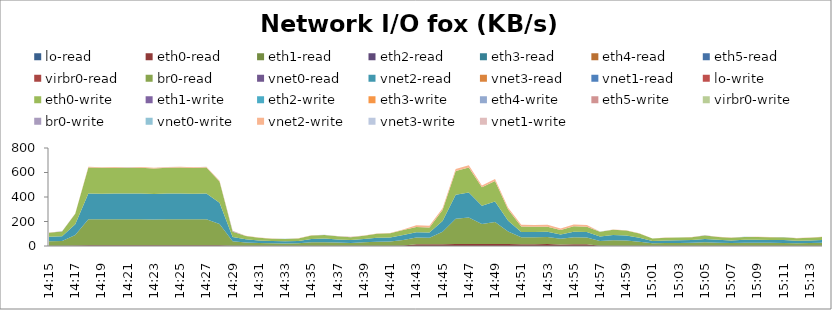
| Category | lo-read | eth0-read | eth1-read | eth2-read | eth3-read | eth4-read | eth5-read | virbr0-read | br0-read | vnet0-read | vnet2-read | vnet3-read | vnet1-read | lo-write | eth0-write | eth1-write | eth2-write | eth3-write | eth4-write | eth5-write | virbr0-write | br0-write | vnet0-write | vnet2-write | vnet3-write | vnet1-write |
|---|---|---|---|---|---|---|---|---|---|---|---|---|---|---|---|---|---|---|---|---|---|---|---|---|---|---|
| 14:15 | 0 | 1.9 | 0 | 0 | 0 | 0 | 0 | 0 | 37.3 | 0 | 36.4 | 0 | 0 | 0 | 32.4 | 0 | 0 | 0 | 0 | 0 | 0 | 0.1 | 0 | 1.7 | 0 | 0 |
| 14:16 | 0 | 2 | 0 | 0 | 0 | 0 | 0 | 0 | 39.2 | 0 | 38.1 | 0 | 0 | 0 | 39.1 | 0 | 0 | 0 | 0 | 0 | 0 | 1.1 | 0.1 | 1.6 | 0.1 | 0.1 |
| 14:17 | 0 | 3.2 | 0 | 0 | 0 | 0 | 0 | 0 | 87.6 | 0 | 86.3 | 0 | 0 | 0 | 85.8 | 0 | 0 | 0 | 0 | 0 | 0 | 0.2 | 0.1 | 2.6 | 0.1 | 0.1 |
| 14:18 | 0 | 6.4 | 0 | 0 | 0 | 0 | 0 | 0 | 212.5 | 0 | 210.6 | 0 | 0 | 0 | 211.6 | 0 | 0 | 0 | 0 | 0 | 0 | 0.3 | 0.1 | 5.5 | 0.1 | 0.1 |
| 14:19 | 0 | 6.2 | 0 | 0 | 0 | 0 | 0 | 0 | 211.5 | 0 | 209.7 | 0 | 0 | 0 | 210.5 | 0 | 0 | 0 | 0 | 0 | 0 | 0 | 0.1 | 5.3 | 0.1 | 0.1 |
| 14:20 | 0 | 6.3 | 0 | 0 | 0 | 0 | 0 | 0 | 211.7 | 0 | 209.9 | 0 | 0 | 0 | 210.6 | 0 | 0 | 0 | 0 | 0 | 0 | 0 | 0.1 | 5.4 | 0.1 | 0.1 |
| 14:21 | 0 | 6.4 | 0 | 0 | 0 | 0 | 0 | 0 | 211.6 | 0 | 209.7 | 0 | 0 | 0 | 210.5 | 0 | 0 | 0 | 0 | 0 | 0 | 0.1 | 0.1 | 5.4 | 0.1 | 0.1 |
| 14:22 | 0 | 6.2 | 0 | 0 | 0 | 0 | 0 | 0 | 211.7 | 0 | 209.9 | 0 | 0 | 0 | 210.8 | 0 | 0 | 0 | 0 | 0 | 0 | 0.1 | 0.1 | 5.3 | 0.1 | 0.1 |
| 14:23 | 0 | 6.2 | 0 | 0 | 0 | 0 | 0 | 0 | 209.6 | 0 | 207.8 | 0 | 0 | 0 | 208.7 | 0 | 0 | 0 | 0 | 0 | 0 | 0.3 | 0.1 | 5.3 | 0.1 | 0.1 |
| 14:24 | 0 | 6.3 | 0 | 0 | 0 | 0 | 0 | 0 | 211.6 | 0 | 209.8 | 0 | 0 | 0 | 210.5 | 0 | 0 | 0 | 0 | 0 | 0 | 0 | 0.1 | 5.4 | 0.1 | 0.1 |
| 14:25 | 0 | 6.3 | 0 | 0 | 0 | 0 | 0 | 0 | 212.4 | 0 | 210.5 | 0 | 0 | 0 | 211.4 | 0 | 0 | 0 | 0 | 0 | 0 | 0.2 | 0.1 | 5.4 | 0.1 | 0.1 |
| 14:26 | 0 | 6.4 | 0 | 0 | 0 | 0 | 0 | 0 | 211.4 | 0 | 209.5 | 0 | 0 | 0 | 210.2 | 0 | 0 | 0 | 0 | 0 | 0 | 0 | 0.1 | 5.5 | 0.1 | 0.1 |
| 14:27 | 0 | 6.5 | 0 | 0 | 0 | 0 | 0 | 0 | 212.3 | 0 | 210.3 | 0 | 0 | 0 | 211 | 0 | 0 | 0 | 0 | 0 | 0 | 0 | 0.1 | 5.6 | 0.1 | 0.1 |
| 14:28 | 0 | 5.4 | 0 | 0 | 0 | 0 | 0 | 0 | 174.5 | 0 | 172.8 | 0 | 0 | 0 | 174.6 | 0 | 0 | 0 | 0 | 0 | 0 | 0 | 0.1 | 4.6 | 0.1 | 0.1 |
| 14:29 | 0 | 2.2 | 0 | 0 | 0 | 0 | 0 | 0 | 36.5 | 0 | 35.2 | 0 | 0 | 0 | 41.9 | 0 | 0 | 0 | 0 | 0 | 0 | 6.4 | 0.1 | 1.6 | 0.1 | 0.1 |
| 14:30 | 0 | 1.7 | 0 | 0 | 0 | 0 | 0 | 0 | 27.2 | 0 | 26.2 | 0 | 0 | 0 | 26.5 | 0 | 0 | 0 | 0 | 0 | 0 | 0 | 0.1 | 1.5 | 0.1 | 0.1 |
| 14:31 | 0 | 1.7 | 0 | 0 | 0 | 0 | 0 | 0 | 22.4 | 0 | 21.4 | 0 | 0 | 0 | 21.8 | 0 | 0 | 0 | 0 | 0 | 0 | 0.3 | 0.1 | 1.5 | 0.1 | 0.1 |
| 14:32 | 0 | 1.7 | 0 | 0 | 0 | 0 | 0 | 0 | 19.8 | 0 | 18.7 | 0 | 0 | 0 | 18.9 | 0 | 0 | 0 | 0 | 0 | 0 | 0 | 0.1 | 1.5 | 0.1 | 0.1 |
| 14:33 | 0 | 1.6 | 0 | 0 | 0 | 0 | 0 | 0 | 19.4 | 0 | 18.5 | 0 | 0 | 0 | 18.6 | 0 | 0 | 0 | 0 | 0 | 0 | 0 | 0.1 | 1.4 | 0.1 | 0.1 |
| 14:34 | 0 | 1.6 | 0 | 0 | 0 | 0 | 0 | 0 | 20.5 | 0 | 19.6 | 0 | 0 | 0 | 19.6 | 0 | 0 | 0 | 0 | 0 | 0 | 0 | 0.1 | 1.4 | 0.1 | 0.1 |
| 14:35 | 0 | 1.8 | 0 | 0 | 0 | 0 | 0 | 0 | 28.4 | 0 | 27.4 | 0 | 0 | 0 | 27.6 | 0 | 0 | 0 | 0 | 0 | 0 | 0.1 | 0.1 | 1.6 | 0.1 | 0.1 |
| 14:36 | 0 | 1.8 | 0 | 0 | 0 | 0 | 0 | 0 | 29.8 | 0 | 28.8 | 0 | 0 | 0 | 28.6 | 0 | 0 | 0 | 0 | 0 | 0 | 0.1 | 0.1 | 1.6 | 0.1 | 0.1 |
| 14:37 | 0 | 1.7 | 0 | 0 | 0 | 0 | 0 | 0 | 26.2 | 0 | 25.2 | 0 | 0 | 0 | 25.8 | 0 | 0 | 0 | 0 | 0 | 0 | 0 | 0.1 | 1.5 | 0.1 | 0.1 |
| 14:38 | 0 | 1.8 | 0 | 0 | 0 | 0 | 0 | 0 | 23.7 | 0 | 22.6 | 0 | 0 | 0 | 24.2 | 0 | 0 | 0 | 0 | 0 | 0 | 1.4 | 0.1 | 1.3 | 0.1 | 0.1 |
| 14:39 | 0 | 1.9 | 0 | 0 | 0 | 0 | 0 | 0 | 27.8 | 0 | 26.7 | 0 | 0 | 0 | 27.1 | 0 | 0 | 0 | 0 | 0 | 0 | 0.5 | 0.1 | 1.6 | 0.1 | 0.1 |
| 14:40 | 0 | 2 | 0 | 0 | 0 | 0 | 0 | 0 | 33.3 | 0 | 32.1 | 0 | 0 | 0 | 32.4 | 0 | 0 | 0 | 0 | 0 | 0 | 0 | 0.1 | 1.8 | 0.1 | 0.1 |
| 14:41 | 0 | 1.8 | 0 | 0 | 0 | 0 | 0 | 0 | 34.8 | 0 | 33.8 | 0 | 0 | 0 | 33.9 | 0 | 0 | 0 | 0 | 0 | 0 | 0.1 | 0.1 | 1.6 | 0.1 | 0.1 |
| 14:42 | 0 | 3.9 | 0 | 0 | 0 | 0 | 0 | 0 | 44.2 | 0 | 41.2 | 0 | 0 | 0 | 41.1 | 0 | 0 | 0 | 0 | 0 | 0 | 0 | 0.1 | 3.8 | 0.1 | 0.1 |
| 14:43 | 0 | 13.5 | 0 | 0 | 0 | 0 | 0 | 0 | 55.4 | 0 | 43.2 | 0 | 0 | 0 | 43.9 | 0 | 0 | 0 | 0 | 0 | 0 | 0 | 0.1 | 13.2 | 0.1 | 0.1 |
| 14:44 | 0 | 13.7 | 0 | 0 | 0 | 0 | 0 | 0 | 54.3 | 0 | 41.8 | 0 | 0.1 | 0 | 41.9 | 0 | 0 | 0 | 0 | 0 | 0 | 0 | 0.1 | 13.2 | 0.1 | 0.3 |
| 14:45 | 0 | 14.5 | 0 | 0 | 0 | 0 | 0 | 0 | 101.4 | 0 | 89.1 | 0 | 0 | 0 | 88.4 | 0 | 0 | 0 | 0 | 0 | 0 | 0.2 | 0.1 | 14 | 0.1 | 0.1 |
| 14:46 | 0 | 16.5 | 0 | 0 | 0 | 0 | 0 | 0 | 206.7 | 0 | 194.3 | 0 | 0 | 0 | 195 | 0 | 0 | 0 | 0 | 0 | 0 | 0 | 0.1 | 15.8 | 0.1 | 0.1 |
| 14:47 | 0 | 17.3 | 0 | 0 | 0 | 0 | 0 | 0 | 216 | 0 | 203.1 | 0 | 0 | 0 | 205.3 | 0 | 0 | 0 | 0 | 0 | 0 | 0 | 0.1 | 16.4 | 0.1 | 0.1 |
| 14:48 | 0 | 15.9 | 0 | 0 | 0 | 0 | 0 | 0 | 162.8 | 0 | 150.4 | 0 | 0 | 0 | 149.6 | 0 | 0 | 0 | 0 | 0 | 0 | 0 | 0.1 | 15.2 | 0.1 | 0.1 |
| 14:49 | 0 | 17 | 0 | 0 | 0 | 0 | 0 | 0 | 179.9 | 0 | 166.7 | 0 | 0 | 0 | 167.1 | 0 | 0 | 0 | 0 | 0 | 0 | 0 | 0.1 | 16.3 | 0.1 | 0.1 |
| 14:50 | 0 | 15.4 | 0 | 0 | 0 | 0 | 0 | 0 | 102 | 0 | 89 | 0 | 0 | 0 | 90.6 | 0 | 0 | 0 | 0 | 0 | 0 | 0.1 | 0.1 | 14.8 | 0.1 | 0.1 |
| 14:51 | 0 | 14.7 | 0 | 0 | 0 | 0 | 0 | 0 | 56.7 | 0 | 43.3 | 0 | 0 | 0 | 43.8 | 0 | 0 | 0 | 0 | 0 | 0 | 0.1 | 0.1 | 14.4 | 0.1 | 0.1 |
| 14:52 | 0 | 14.7 | 0 | 0 | 0 | 0 | 0 | 0 | 56.3 | 0 | 43 | 0 | 0 | 0 | 43.1 | 0 | 0 | 0 | 0 | 0 | 0 | 0.1 | 0.1 | 14.4 | 0.1 | 0.1 |
| 14:53 | 0 | 16.2 | 0 | 0 | 0 | 0 | 0 | 0 | 57 | 0 | 42.2 | 0 | 0 | 0 | 42.5 | 0 | 0 | 0 | 0 | 0 | 0 | 0 | 0.1 | 15.9 | 0.1 | 0.1 |
| 14:54 | 0 | 12.1 | 0 | 0 | 0 | 0 | 0 | 0 | 46.6 | 0 | 35.6 | 0 | 0 | 0 | 35.8 | 0 | 0 | 0 | 0 | 0 | 0 | 0 | 0.1 | 11.9 | 0.1 | 0.1 |
| 14:55 | 0 | 14.8 | 0 | 0 | 0 | 0 | 0 | 0 | 57.6 | 0 | 44.2 | 0 | 0 | 0 | 44.4 | 0 | 0 | 0 | 0 | 0 | 0 | 0 | 0.1 | 14.5 | 0.1 | 0.1 |
| 14:56 | 0 | 14.4 | 0 | 0 | 0 | 0 | 0 | 0 | 56 | 0 | 42.9 | 0 | 0 | 0 | 43.2 | 0 | 0 | 0 | 0 | 0 | 0 | 0.1 | 0.1 | 14 | 0.1 | 0.1 |
| 14:57 | 0 | 2.1 | 0 | 0 | 0 | 0 | 0 | 0 | 38.4 | 0 | 37.3 | 0 | 0 | 0 | 37.6 | 0 | 0 | 0 | 0 | 0 | 0 | 0 | 0.1 | 1.8 | 0.1 | 0.1 |
| 14:58 | 0 | 2.1 | 0 | 0 | 0 | 0 | 0 | 0 | 43.9 | 0 | 42.8 | 0 | 0 | 0 | 43 | 0 | 0 | 0 | 0 | 0 | 0 | 0 | 0.1 | 1.9 | 0.1 | 0.1 |
| 14:59 | 0 | 2.1 | 0 | 0 | 0 | 0 | 0 | 0 | 42.1 | 0 | 41 | 0 | 0 | 0 | 41.4 | 0 | 0 | 0 | 0 | 0 | 0 | 0.2 | 0.1 | 1.8 | 0.1 | 0.1 |
| 15:00 | 0 | 1.8 | 0 | 0 | 0 | 0 | 0 | 0 | 33.7 | 0 | 32.8 | 0 | 0 | 0 | 33.1 | 0 | 0 | 0 | 0 | 0 | 0 | 0.1 | 0.1 | 1.5 | 0.1 | 0.1 |
| 15:01 | 0 | 1.6 | 0 | 0 | 0 | 0 | 0 | 0 | 20.2 | 0 | 19.2 | 0 | 0 | 0 | 19.4 | 0 | 0 | 0 | 0 | 0 | 0 | 0 | 0.1 | 1.4 | 0.1 | 0.1 |
| 15:02 | 0 | 1.6 | 0 | 0 | 0 | 0 | 0 | 0 | 22.4 | 0 | 21.4 | 0 | 0 | 0 | 21.6 | 0 | 0 | 0 | 0 | 0 | 0 | 0 | 0.1 | 1.4 | 0.1 | 0.1 |
| 15:03 | 0 | 1.6 | 0 | 0 | 0 | 0 | 0 | 0 | 23.1 | 0 | 22.1 | 0 | 0 | 0 | 21.8 | 0 | 0 | 0 | 0 | 0 | 0 | 0 | 0.1 | 1.4 | 0.1 | 0.1 |
| 15:04 | 0 | 1.8 | 0 | 0 | 0 | 0 | 0 | 0 | 24 | 0 | 23 | 0 | 0 | 0 | 23.2 | 0 | 0 | 0 | 0 | 0 | 0 | 0 | 0.1 | 1.6 | 0.1 | 0.1 |
| 15:05 | 0 | 1.8 | 0 | 0 | 0 | 0 | 0 | 0 | 28.2 | 0 | 27.2 | 0 | 0 | 0 | 28.5 | 0 | 0 | 0 | 0 | 0 | 0 | 1.1 | 0.1 | 1.6 | 0.1 | 0.1 |
| 15:06 | 0 | 1.9 | 0 | 0 | 0 | 0 | 0 | 0 | 24.9 | 0 | 23.7 | 0 | 0 | 0 | 23.7 | 0 | 0 | 0 | 0 | 0 | 0 | 0 | 0.1 | 1.7 | 0.1 | 0.1 |
| 15:07 | 0 | 1.6 | 0 | 0 | 0 | 0 | 0 | 0 | 22.5 | 0 | 21.6 | 0 | 0 | 0 | 21.8 | 0 | 0 | 0 | 0 | 0 | 0 | 0 | 0.1 | 1.4 | 0.1 | 0.1 |
| 15:08 | 0 | 1.6 | 0 | 0 | 0 | 0 | 0 | 0 | 24.7 | 0 | 23.8 | 0 | 0 | 0 | 24.1 | 0 | 0 | 0 | 0 | 0 | 0 | 0.2 | 0.1 | 1.4 | 0.1 | 0.1 |
| 15:09 | 0 | 2 | 0 | 0 | 0 | 0 | 0 | 0 | 24.7 | 0 | 23.5 | 0 | 0 | 0 | 23.7 | 0 | 0 | 0 | 0 | 0 | 0 | 0 | 0.1 | 1.8 | 0.1 | 0.1 |
| 15:10 | 0 | 1.8 | 0 | 0 | 0 | 0 | 0 | 0 | 24 | 0 | 22.8 | 0 | 0 | 0 | 22.8 | 0 | 0 | 0 | 0 | 0 | 0 | 0 | 0.1 | 1.7 | 0.1 | 0.1 |
| 15:11 | 0 | 1.6 | 0 | 0 | 0 | 0 | 0 | 0 | 23.7 | 0 | 22.7 | 0 | 0 | 0 | 22.8 | 0 | 0 | 0 | 0 | 0 | 0 | 0 | 0.1 | 1.5 | 0.1 | 0.1 |
| 15:12 | 0 | 1.7 | 0 | 0 | 0 | 0 | 0 | 0 | 21.2 | 0 | 20.2 | 0 | 0 | 0 | 20.4 | 0 | 0 | 0 | 0 | 0 | 0 | 0 | 0.1 | 1.5 | 0.1 | 0.1 |
| 15:13 | 0 | 1.7 | 0 | 0 | 0 | 0 | 0 | 0 | 22.5 | 0 | 21.5 | 0 | 0 | 0 | 21.5 | 0 | 0 | 0 | 0 | 0 | 0 | 0 | 0.1 | 1.5 | 0.1 | 0.1 |
| 15:14 | 0 | 1.7 | 0 | 0 | 0 | 0 | 0 | 0 | 24.7 | 0 | 23.7 | 0 | 0 | 0 | 23.9 | 0 | 0 | 0 | 0 | 0 | 0 | 0 | 0.1 | 1.5 | 0.1 | 0.1 |